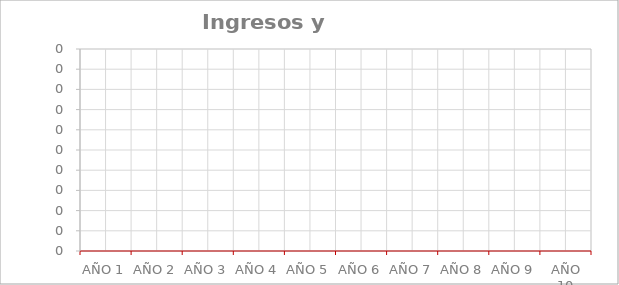
| Category | VENTAS previstas | GASTOS previstos |
|---|---|---|
| AÑO 1 | 0 | 0 |
| AÑO 2 | 0 | 0 |
| AÑO 3 | 0 | 0 |
| AÑO 4 | 0 | 0 |
| AÑO 5 | 0 | 0 |
| AÑO 6 | 0 | 0 |
| AÑO 7 | 0 | 0 |
| AÑO 8 | 0 | 0 |
| AÑO 9 | 0 | 0 |
| AÑO 10 | 0 | 0 |